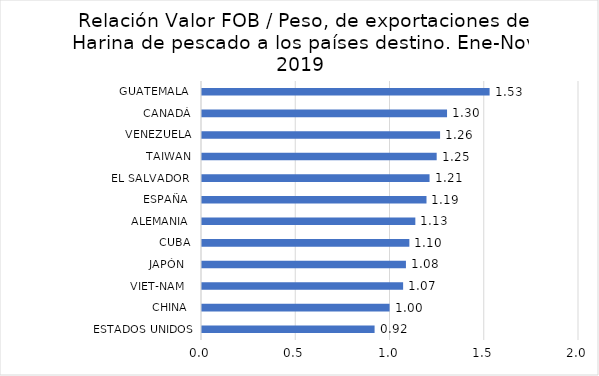
| Category | Series 0 |
|---|---|
| ESTADOS UNIDOS | 0.916 |
| CHINA  | 0.995 |
| VIET-NAM   | 1.067 |
| JAPÓN   | 1.082 |
| CUBA | 1.1 |
| ALEMANIA  | 1.132 |
| ESPAÑA  | 1.191 |
| EL SALVADOR  | 1.207 |
| TAIWAN | 1.245 |
| VENEZUELA | 1.263 |
| CANADÁ | 1.3 |
| GUATEMALA  | 1.526 |